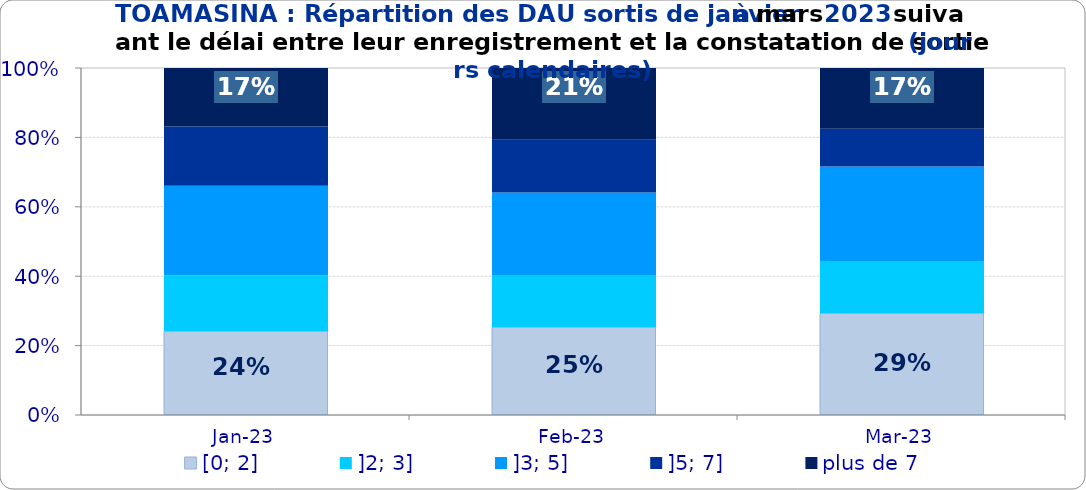
| Category | [0; 2] | ]2; 3] | ]3; 5] | ]5; 7] | plus de 7 |
|---|---|---|---|---|---|
| 2023-01-01 | 0.242 | 0.161 | 0.258 | 0.171 | 0.169 |
| 2023-02-01 | 0.253 | 0.15 | 0.238 | 0.152 | 0.207 |
| 2023-03-01 | 0.293 | 0.151 | 0.272 | 0.109 | 0.175 |